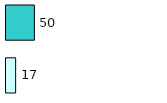
| Category | Series 0 | Series 1 |
|---|---|---|
| 0 | 17 | 50 |